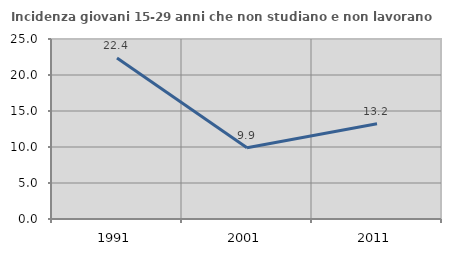
| Category | Incidenza giovani 15-29 anni che non studiano e non lavorano  |
|---|---|
| 1991.0 | 22.353 |
| 2001.0 | 9.887 |
| 2011.0 | 13.223 |